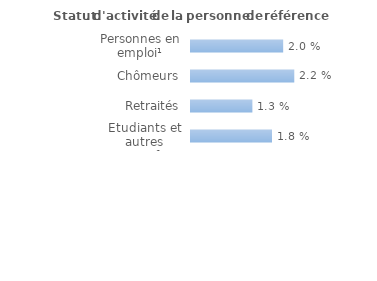
| Category | Series 0 |
|---|---|
| Personnes en emploi¹ | 0.02 |
| Chômeurs | 0.022 |
| Retraités | 0.013 |
| Etudiants et autres inactifs | 0.018 |